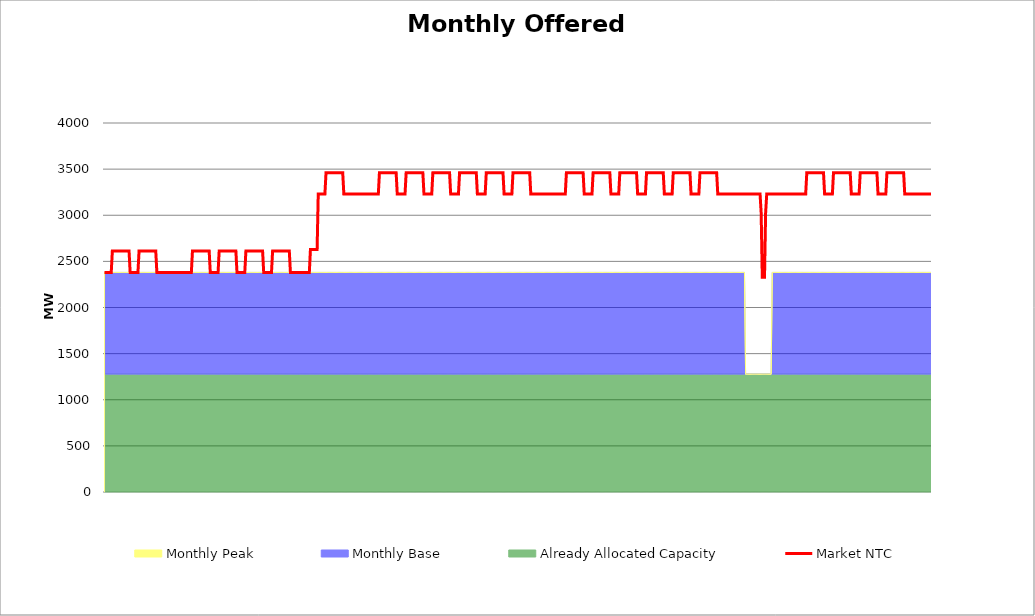
| Category | Market NTC |
|---|---|
| 0 | 2380 |
| 1 | 2380 |
| 2 | 2380 |
| 3 | 2380 |
| 4 | 2380 |
| 5 | 2380 |
| 6 | 2380 |
| 7 | 2612 |
| 8 | 2612 |
| 9 | 2612 |
| 10 | 2612 |
| 11 | 2612 |
| 12 | 2612 |
| 13 | 2612 |
| 14 | 2612 |
| 15 | 2612 |
| 16 | 2612 |
| 17 | 2612 |
| 18 | 2612 |
| 19 | 2612 |
| 20 | 2612 |
| 21 | 2612 |
| 22 | 2612 |
| 23 | 2380 |
| 24 | 2380 |
| 25 | 2380 |
| 26 | 2380 |
| 27 | 2380 |
| 28 | 2380 |
| 29 | 2380 |
| 30 | 2380 |
| 31 | 2612 |
| 32 | 2612 |
| 33 | 2612 |
| 34 | 2612 |
| 35 | 2612 |
| 36 | 2612 |
| 37 | 2612 |
| 38 | 2612 |
| 39 | 2612 |
| 40 | 2612 |
| 41 | 2612 |
| 42 | 2612 |
| 43 | 2612 |
| 44 | 2612 |
| 45 | 2612 |
| 46 | 2612 |
| 47 | 2380 |
| 48 | 2380 |
| 49 | 2380 |
| 50 | 2380 |
| 51 | 2380 |
| 52 | 2380 |
| 53 | 2380 |
| 54 | 2380 |
| 55 | 2380 |
| 56 | 2380 |
| 57 | 2380 |
| 58 | 2380 |
| 59 | 2380 |
| 60 | 2380 |
| 61 | 2380 |
| 62 | 2380 |
| 63 | 2380 |
| 64 | 2380 |
| 65 | 2380 |
| 66 | 2380 |
| 67 | 2380 |
| 68 | 2380 |
| 69 | 2380 |
| 70 | 2380 |
| 71 | 2380 |
| 72 | 2380 |
| 73 | 2380 |
| 74 | 2380 |
| 75 | 2380 |
| 76 | 2380 |
| 77 | 2380 |
| 78 | 2380 |
| 79 | 2612 |
| 80 | 2612 |
| 81 | 2612 |
| 82 | 2612 |
| 83 | 2612 |
| 84 | 2612 |
| 85 | 2612 |
| 86 | 2612 |
| 87 | 2612 |
| 88 | 2612 |
| 89 | 2612 |
| 90 | 2612 |
| 91 | 2612 |
| 92 | 2612 |
| 93 | 2612 |
| 94 | 2612 |
| 95 | 2380 |
| 96 | 2380 |
| 97 | 2380 |
| 98 | 2380 |
| 99 | 2380 |
| 100 | 2380 |
| 101 | 2380 |
| 102 | 2380 |
| 103 | 2612 |
| 104 | 2612 |
| 105 | 2612 |
| 106 | 2612 |
| 107 | 2612 |
| 108 | 2612 |
| 109 | 2612 |
| 110 | 2612 |
| 111 | 2612 |
| 112 | 2612 |
| 113 | 2612 |
| 114 | 2612 |
| 115 | 2612 |
| 116 | 2612 |
| 117 | 2612 |
| 118 | 2612 |
| 119 | 2380 |
| 120 | 2380 |
| 121 | 2380 |
| 122 | 2380 |
| 123 | 2380 |
| 124 | 2380 |
| 125 | 2380 |
| 126 | 2380 |
| 127 | 2612 |
| 128 | 2612 |
| 129 | 2612 |
| 130 | 2612 |
| 131 | 2612 |
| 132 | 2612 |
| 133 | 2612 |
| 134 | 2612 |
| 135 | 2612 |
| 136 | 2612 |
| 137 | 2612 |
| 138 | 2612 |
| 139 | 2612 |
| 140 | 2612 |
| 141 | 2612 |
| 142 | 2612 |
| 143 | 2380 |
| 144 | 2380 |
| 145 | 2380 |
| 146 | 2380 |
| 147 | 2380 |
| 148 | 2380 |
| 149 | 2380 |
| 150 | 2380 |
| 151 | 2612 |
| 152 | 2612 |
| 153 | 2612 |
| 154 | 2612 |
| 155 | 2612 |
| 156 | 2612 |
| 157 | 2612 |
| 158 | 2612 |
| 159 | 2612 |
| 160 | 2612 |
| 161 | 2612 |
| 162 | 2612 |
| 163 | 2612 |
| 164 | 2612 |
| 165 | 2612 |
| 166 | 2612 |
| 167 | 2380 |
| 168 | 2380 |
| 169 | 2380 |
| 170 | 2380 |
| 171 | 2380 |
| 172 | 2380 |
| 173 | 2380 |
| 174 | 2380 |
| 175 | 2380 |
| 176 | 2380 |
| 177 | 2380 |
| 178 | 2380 |
| 179 | 2380 |
| 180 | 2380 |
| 181 | 2380 |
| 182 | 2380 |
| 183 | 2380 |
| 184 | 2380 |
| 185 | 2630 |
| 186 | 2630 |
| 187 | 2630 |
| 188 | 2630 |
| 189 | 2630 |
| 190 | 2630 |
| 191 | 2630 |
| 192 | 3230 |
| 193 | 3230 |
| 194 | 3230 |
| 195 | 3230 |
| 196 | 3230 |
| 197 | 3230 |
| 198 | 3230 |
| 199 | 3462 |
| 200 | 3462 |
| 201 | 3462 |
| 202 | 3462 |
| 203 | 3462 |
| 204 | 3462 |
| 205 | 3462 |
| 206 | 3462 |
| 207 | 3462 |
| 208 | 3462 |
| 209 | 3462 |
| 210 | 3462 |
| 211 | 3462 |
| 212 | 3462 |
| 213 | 3462 |
| 214 | 3462 |
| 215 | 3230 |
| 216 | 3230 |
| 217 | 3230 |
| 218 | 3230 |
| 219 | 3230 |
| 220 | 3230 |
| 221 | 3230 |
| 222 | 3230 |
| 223 | 3230 |
| 224 | 3230 |
| 225 | 3230 |
| 226 | 3230 |
| 227 | 3230 |
| 228 | 3230 |
| 229 | 3230 |
| 230 | 3230 |
| 231 | 3230 |
| 232 | 3230 |
| 233 | 3230 |
| 234 | 3230 |
| 235 | 3230 |
| 236 | 3230 |
| 237 | 3230 |
| 238 | 3230 |
| 239 | 3230 |
| 240 | 3230 |
| 241 | 3230 |
| 242 | 3230 |
| 243 | 3230 |
| 244 | 3230 |
| 245 | 3230 |
| 246 | 3230 |
| 247 | 3462 |
| 248 | 3462 |
| 249 | 3462 |
| 250 | 3462 |
| 251 | 3462 |
| 252 | 3462 |
| 253 | 3462 |
| 254 | 3462 |
| 255 | 3462 |
| 256 | 3462 |
| 257 | 3462 |
| 258 | 3462 |
| 259 | 3462 |
| 260 | 3462 |
| 261 | 3462 |
| 262 | 3462 |
| 263 | 3230 |
| 264 | 3230 |
| 265 | 3230 |
| 266 | 3230 |
| 267 | 3230 |
| 268 | 3230 |
| 269 | 3230 |
| 270 | 3230 |
| 271 | 3462 |
| 272 | 3462 |
| 273 | 3462 |
| 274 | 3462 |
| 275 | 3462 |
| 276 | 3462 |
| 277 | 3462 |
| 278 | 3462 |
| 279 | 3462 |
| 280 | 3462 |
| 281 | 3462 |
| 282 | 3462 |
| 283 | 3462 |
| 284 | 3462 |
| 285 | 3462 |
| 286 | 3462 |
| 287 | 3230 |
| 288 | 3230 |
| 289 | 3230 |
| 290 | 3230 |
| 291 | 3230 |
| 292 | 3230 |
| 293 | 3230 |
| 294 | 3230 |
| 295 | 3462 |
| 296 | 3462 |
| 297 | 3462 |
| 298 | 3462 |
| 299 | 3462 |
| 300 | 3462 |
| 301 | 3462 |
| 302 | 3462 |
| 303 | 3462 |
| 304 | 3462 |
| 305 | 3462 |
| 306 | 3462 |
| 307 | 3462 |
| 308 | 3462 |
| 309 | 3462 |
| 310 | 3462 |
| 311 | 3230 |
| 312 | 3230 |
| 313 | 3230 |
| 314 | 3230 |
| 315 | 3230 |
| 316 | 3230 |
| 317 | 3230 |
| 318 | 3230 |
| 319 | 3462 |
| 320 | 3462 |
| 321 | 3462 |
| 322 | 3462 |
| 323 | 3462 |
| 324 | 3462 |
| 325 | 3462 |
| 326 | 3462 |
| 327 | 3462 |
| 328 | 3462 |
| 329 | 3462 |
| 330 | 3462 |
| 331 | 3462 |
| 332 | 3462 |
| 333 | 3462 |
| 334 | 3462 |
| 335 | 3230 |
| 336 | 3230 |
| 337 | 3230 |
| 338 | 3230 |
| 339 | 3230 |
| 340 | 3230 |
| 341 | 3230 |
| 342 | 3230 |
| 343 | 3462 |
| 344 | 3462 |
| 345 | 3462 |
| 346 | 3462 |
| 347 | 3462 |
| 348 | 3462 |
| 349 | 3462 |
| 350 | 3462 |
| 351 | 3462 |
| 352 | 3462 |
| 353 | 3462 |
| 354 | 3462 |
| 355 | 3462 |
| 356 | 3462 |
| 357 | 3462 |
| 358 | 3462 |
| 359 | 3230 |
| 360 | 3230 |
| 361 | 3230 |
| 362 | 3230 |
| 363 | 3230 |
| 364 | 3230 |
| 365 | 3230 |
| 366 | 3230 |
| 367 | 3462 |
| 368 | 3462 |
| 369 | 3462 |
| 370 | 3462 |
| 371 | 3462 |
| 372 | 3462 |
| 373 | 3462 |
| 374 | 3462 |
| 375 | 3462 |
| 376 | 3462 |
| 377 | 3462 |
| 378 | 3462 |
| 379 | 3462 |
| 380 | 3462 |
| 381 | 3462 |
| 382 | 3462 |
| 383 | 3230 |
| 384 | 3230 |
| 385 | 3230 |
| 386 | 3230 |
| 387 | 3230 |
| 388 | 3230 |
| 389 | 3230 |
| 390 | 3230 |
| 391 | 3230 |
| 392 | 3230 |
| 393 | 3230 |
| 394 | 3230 |
| 395 | 3230 |
| 396 | 3230 |
| 397 | 3230 |
| 398 | 3230 |
| 399 | 3230 |
| 400 | 3230 |
| 401 | 3230 |
| 402 | 3230 |
| 403 | 3230 |
| 404 | 3230 |
| 405 | 3230 |
| 406 | 3230 |
| 407 | 3230 |
| 408 | 3230 |
| 409 | 3230 |
| 410 | 3230 |
| 411 | 3230 |
| 412 | 3230 |
| 413 | 3230 |
| 414 | 3230 |
| 415 | 3462 |
| 416 | 3462 |
| 417 | 3462 |
| 418 | 3462 |
| 419 | 3462 |
| 420 | 3462 |
| 421 | 3462 |
| 422 | 3462 |
| 423 | 3462 |
| 424 | 3462 |
| 425 | 3462 |
| 426 | 3462 |
| 427 | 3462 |
| 428 | 3462 |
| 429 | 3462 |
| 430 | 3462 |
| 431 | 3230 |
| 432 | 3230 |
| 433 | 3230 |
| 434 | 3230 |
| 435 | 3230 |
| 436 | 3230 |
| 437 | 3230 |
| 438 | 3230 |
| 439 | 3462 |
| 440 | 3462 |
| 441 | 3462 |
| 442 | 3462 |
| 443 | 3462 |
| 444 | 3462 |
| 445 | 3462 |
| 446 | 3462 |
| 447 | 3462 |
| 448 | 3462 |
| 449 | 3462 |
| 450 | 3462 |
| 451 | 3462 |
| 452 | 3462 |
| 453 | 3462 |
| 454 | 3462 |
| 455 | 3230 |
| 456 | 3230 |
| 457 | 3230 |
| 458 | 3230 |
| 459 | 3230 |
| 460 | 3230 |
| 461 | 3230 |
| 462 | 3230 |
| 463 | 3462 |
| 464 | 3462 |
| 465 | 3462 |
| 466 | 3462 |
| 467 | 3462 |
| 468 | 3462 |
| 469 | 3462 |
| 470 | 3462 |
| 471 | 3462 |
| 472 | 3462 |
| 473 | 3462 |
| 474 | 3462 |
| 475 | 3462 |
| 476 | 3462 |
| 477 | 3462 |
| 478 | 3462 |
| 479 | 3230 |
| 480 | 3230 |
| 481 | 3230 |
| 482 | 3230 |
| 483 | 3230 |
| 484 | 3230 |
| 485 | 3230 |
| 486 | 3230 |
| 487 | 3462 |
| 488 | 3462 |
| 489 | 3462 |
| 490 | 3462 |
| 491 | 3462 |
| 492 | 3462 |
| 493 | 3462 |
| 494 | 3462 |
| 495 | 3462 |
| 496 | 3462 |
| 497 | 3462 |
| 498 | 3462 |
| 499 | 3462 |
| 500 | 3462 |
| 501 | 3462 |
| 502 | 3462 |
| 503 | 3230 |
| 504 | 3230 |
| 505 | 3230 |
| 506 | 3230 |
| 507 | 3230 |
| 508 | 3230 |
| 509 | 3230 |
| 510 | 3230 |
| 511 | 3462 |
| 512 | 3462 |
| 513 | 3462 |
| 514 | 3462 |
| 515 | 3462 |
| 516 | 3462 |
| 517 | 3462 |
| 518 | 3462 |
| 519 | 3462 |
| 520 | 3462 |
| 521 | 3462 |
| 522 | 3462 |
| 523 | 3462 |
| 524 | 3462 |
| 525 | 3462 |
| 526 | 3462 |
| 527 | 3230 |
| 528 | 3230 |
| 529 | 3230 |
| 530 | 3230 |
| 531 | 3230 |
| 532 | 3230 |
| 533 | 3230 |
| 534 | 3230 |
| 535 | 3462 |
| 536 | 3462 |
| 537 | 3462 |
| 538 | 3462 |
| 539 | 3462 |
| 540 | 3462 |
| 541 | 3462 |
| 542 | 3462 |
| 543 | 3462 |
| 544 | 3462 |
| 545 | 3462 |
| 546 | 3462 |
| 547 | 3462 |
| 548 | 3462 |
| 549 | 3462 |
| 550 | 3462 |
| 551 | 3230 |
| 552 | 3230 |
| 553 | 3230 |
| 554 | 3230 |
| 555 | 3230 |
| 556 | 3230 |
| 557 | 3230 |
| 558 | 3230 |
| 559 | 3230 |
| 560 | 3230 |
| 561 | 3230 |
| 562 | 3230 |
| 563 | 3230 |
| 564 | 3230 |
| 565 | 3230 |
| 566 | 3230 |
| 567 | 3230 |
| 568 | 3230 |
| 569 | 3230 |
| 570 | 3230 |
| 571 | 3230 |
| 572 | 3230 |
| 573 | 3230 |
| 574 | 3230 |
| 575 | 3230 |
| 576 | 3230 |
| 577 | 3230 |
| 578 | 3230 |
| 579 | 3230 |
| 580 | 3230 |
| 581 | 3230 |
| 582 | 3230 |
| 583 | 3230 |
| 584 | 3230 |
| 585 | 3230 |
| 586 | 3230 |
| 587 | 3230 |
| 588 | 3230 |
| 589 | 3230 |
| 590 | 3025 |
| 591 | 2327 |
| 592 | 2327 |
| 593 | 2327 |
| 594 | 3025 |
| 595 | 3230 |
| 596 | 3230 |
| 597 | 3230 |
| 598 | 3230 |
| 599 | 3230 |
| 600 | 3230 |
| 601 | 3230 |
| 602 | 3230 |
| 603 | 3230 |
| 604 | 3230 |
| 605 | 3230 |
| 606 | 3230 |
| 607 | 3230 |
| 608 | 3230 |
| 609 | 3230 |
| 610 | 3230 |
| 611 | 3230 |
| 612 | 3230 |
| 613 | 3230 |
| 614 | 3230 |
| 615 | 3230 |
| 616 | 3230 |
| 617 | 3230 |
| 618 | 3230 |
| 619 | 3230 |
| 620 | 3230 |
| 621 | 3230 |
| 622 | 3230 |
| 623 | 3230 |
| 624 | 3230 |
| 625 | 3230 |
| 626 | 3230 |
| 627 | 3230 |
| 628 | 3230 |
| 629 | 3230 |
| 630 | 3230 |
| 631 | 3462 |
| 632 | 3462 |
| 633 | 3462 |
| 634 | 3462 |
| 635 | 3462 |
| 636 | 3462 |
| 637 | 3462 |
| 638 | 3462 |
| 639 | 3462 |
| 640 | 3462 |
| 641 | 3462 |
| 642 | 3462 |
| 643 | 3462 |
| 644 | 3462 |
| 645 | 3462 |
| 646 | 3462 |
| 647 | 3230 |
| 648 | 3230 |
| 649 | 3230 |
| 650 | 3230 |
| 651 | 3230 |
| 652 | 3230 |
| 653 | 3230 |
| 654 | 3230 |
| 655 | 3462 |
| 656 | 3462 |
| 657 | 3462 |
| 658 | 3462 |
| 659 | 3462 |
| 660 | 3462 |
| 661 | 3462 |
| 662 | 3462 |
| 663 | 3462 |
| 664 | 3462 |
| 665 | 3462 |
| 666 | 3462 |
| 667 | 3462 |
| 668 | 3462 |
| 669 | 3462 |
| 670 | 3462 |
| 671 | 3230 |
| 672 | 3230 |
| 673 | 3230 |
| 674 | 3230 |
| 675 | 3230 |
| 676 | 3230 |
| 677 | 3230 |
| 678 | 3230 |
| 679 | 3462 |
| 680 | 3462 |
| 681 | 3462 |
| 682 | 3462 |
| 683 | 3462 |
| 684 | 3462 |
| 685 | 3462 |
| 686 | 3462 |
| 687 | 3462 |
| 688 | 3462 |
| 689 | 3462 |
| 690 | 3462 |
| 691 | 3462 |
| 692 | 3462 |
| 693 | 3462 |
| 694 | 3462 |
| 695 | 3230 |
| 696 | 3230 |
| 697 | 3230 |
| 698 | 3230 |
| 699 | 3230 |
| 700 | 3230 |
| 701 | 3230 |
| 702 | 3230 |
| 703 | 3462 |
| 704 | 3462 |
| 705 | 3462 |
| 706 | 3462 |
| 707 | 3462 |
| 708 | 3462 |
| 709 | 3462 |
| 710 | 3462 |
| 711 | 3462 |
| 712 | 3462 |
| 713 | 3462 |
| 714 | 3462 |
| 715 | 3462 |
| 716 | 3462 |
| 717 | 3462 |
| 718 | 3462 |
| 719 | 3230 |
| 720 | 3230 |
| 721 | 3230 |
| 722 | 3230 |
| 723 | 3230 |
| 724 | 3230 |
| 725 | 3230 |
| 726 | 3230 |
| 727 | 3230 |
| 728 | 3230 |
| 729 | 3230 |
| 730 | 3230 |
| 731 | 3230 |
| 732 | 3230 |
| 733 | 3230 |
| 734 | 3230 |
| 735 | 3230 |
| 736 | 3230 |
| 737 | 3230 |
| 738 | 3230 |
| 739 | 3230 |
| 740 | 3230 |
| 741 | 3230 |
| 742 | 3230 |
| 743 | 3230 |